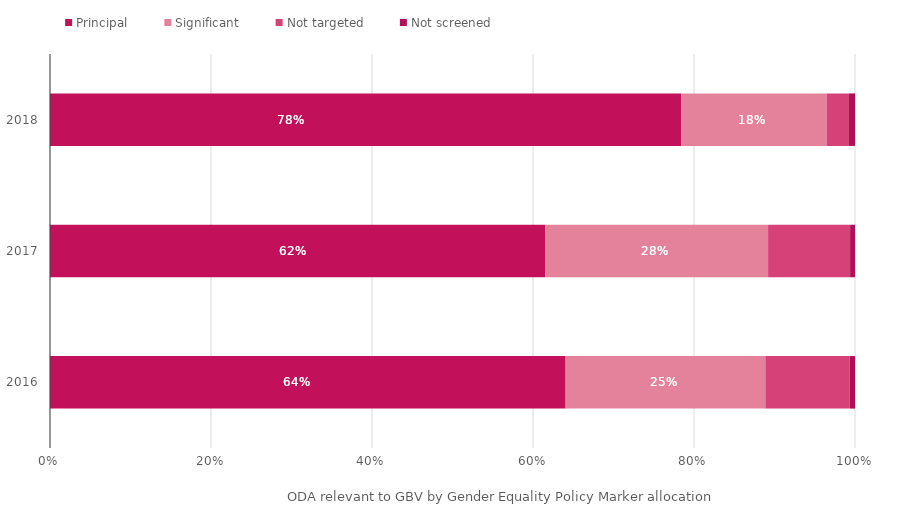
| Category | Principal | Significant | Not targeted | Not screened |
|---|---|---|---|---|
| 2016.0 | 0.64 | 0.248 | 0.105 | 0.006 |
| 2017.0 | 0.615 | 0.277 | 0.102 | 0.006 |
| 2018.0 | 0.784 | 0.18 | 0.028 | 0.007 |